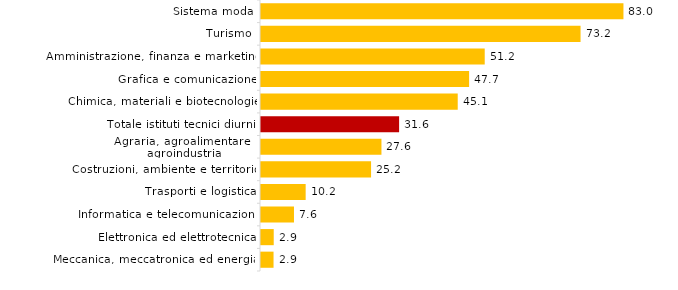
| Category | Quota Fem. |
|---|---|
| Meccanica, meccatronica ed energia | 2.872 |
| Elettronica ed elettrotecnica | 2.914 |
| Informatica e telecomunicazioni | 7.554 |
| Trasporti e logistica | 10.228 |
| Costruzioni, ambiente e territorio | 25.206 |
| Agraria, agroalimentare e agroindustria | 27.584 |
| Totale istituti tecnici diurni | 31.628 |
| Chimica, materiali e biotecnologie | 45.052 |
| Grafica e comunicazione | 47.658 |
| Amministrazione, finanza e marketing | 51.235 |
| Turismo | 73.181 |
| Sistema moda | 83.003 |